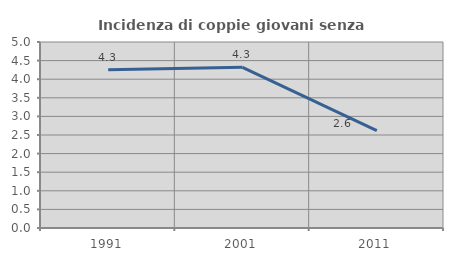
| Category | Incidenza di coppie giovani senza figli |
|---|---|
| 1991.0 | 4.254 |
| 2001.0 | 4.32 |
| 2011.0 | 2.619 |